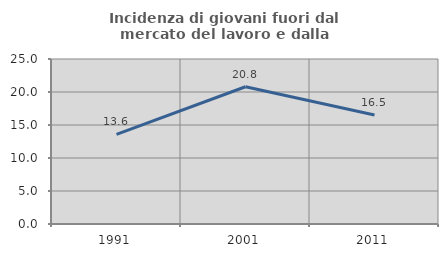
| Category | Incidenza di giovani fuori dal mercato del lavoro e dalla formazione  |
|---|---|
| 1991.0 | 13.569 |
| 2001.0 | 20.793 |
| 2011.0 | 16.523 |